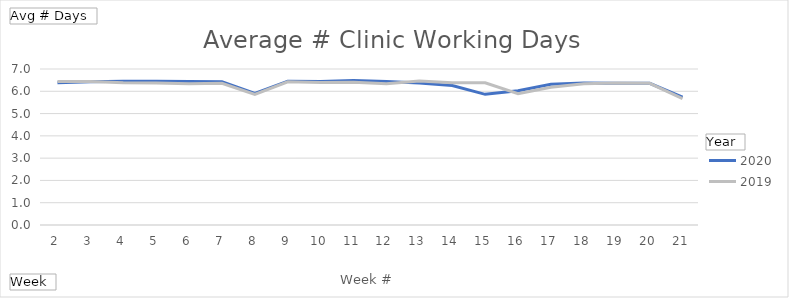
| Category | 2020 | 2019 |
|---|---|---|
| 2 | 6.384 | 6.438 |
| 3 | 6.425 | 6.438 |
| 4 | 6.452 | 6.384 |
| 5 | 6.452 | 6.37 |
| 6 | 6.438 | 6.342 |
| 7 | 6.425 | 6.356 |
| 8 | 5.904 | 5.863 |
| 9 | 6.452 | 6.425 |
| 10 | 6.438 | 6.397 |
| 11 | 6.479 | 6.411 |
| 12 | 6.438 | 6.342 |
| 13 | 6.37 | 6.466 |
| 14 | 6.26 | 6.384 |
| 15 | 5.863 | 6.384 |
| 16 | 6.027 | 5.89 |
| 17 | 6.315 | 6.178 |
| 18 | 6.37 | 6.342 |
| 19 | 6.356 | 6.37 |
| 20 | 6.356 | 6.356 |
| 21 | 5.74 | 5.671 |